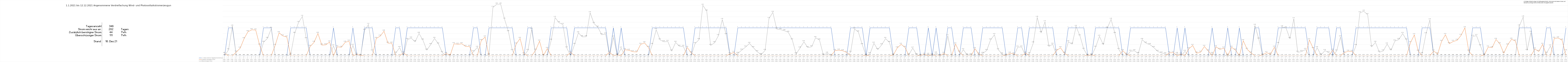
| Category | 1 = Strom reicht im Tagesdurchschnitt aus | Zusätzlich benötigter Strom | Überschüssiger Strom |
|---|---|---|---|
| 0 | 0 | 0.08 | 0 |
| 1 | 1 | 0 | 0.21 |
| 2 | 1 | 0 | 1.06 |
| 3 | 0 | 0.13 | 0 |
| 4 | 0 | 0.27 | 0 |
| 5 | 0 | 0.61 | 0 |
| 6 | 0 | 0.86 | 0 |
| 7 | 0 | 0.93 | 0 |
| 8 | 0 | 0.92 | 0 |
| 9 | 0 | 0.38 | 0 |
| 10 | 1 | 0 | 0.48 |
| 11 | 1 | 0 | 0.62 |
| 12 | 1 | 0 | 0.97 |
| 13 | 0 | 0.37 | 0 |
| 14 | 0 | 0.82 | 0 |
| 15 | 0 | 0.71 | 0 |
| 16 | 0 | 0.67 | 0 |
| 17 | 1 | 0 | 0.05 |
| 18 | 1 | 0 | 0.8 |
| 19 | 1 | 0 | 1.19 |
| 20 | 1 | 0 | 1.41 |
| 21 | 1 | 0 | 0.61 |
| 22 | 0 | 0.33 | 0 |
| 23 | 0 | 0.48 | 0 |
| 24 | 0 | 0.8 | 0 |
| 25 | 0 | 0.38 | 0 |
| 26 | 0 | 0.39 | 0 |
| 27 | 0 | 0.49 | 0 |
| 28 | 1 | 0 | 0.35 |
| 29 | 0 | 0.32 | 0 |
| 30 | 0 | 0.3 | 0 |
| 31 | 0 | 0.48 | 0 |
| 32 | 0 | 0.52 | 0 |
| 33 | 1 | 0 | 0.37 |
| 34 | 0 | 0.05 | 0 |
| 35 | 0 | 0.01 | 0 |
| 36 | 1 | 0 | 0.91 |
| 37 | 1 | 0 | 1.12 |
| 38 | 1 | 0 | 0.17 |
| 39 | 0 | 0.62 | 0 |
| 40 | 0 | 0.7 | 0 |
| 41 | 0 | 0.88 | 0 |
| 42 | 0 | 0.45 | 0 |
| 43 | 0 | 0.45 | 0 |
| 44 | 1 | 0 | 0.09 |
| 45 | 1 | 0 | 0.29 |
| 46 | 0 | 0.1 | 0 |
| 47 | 1 | 0 | 0.58 |
| 48 | 1 | 0 | 0.63 |
| 49 | 1 | 0 | 0.5 |
| 50 | 1 | 0 | 0.8 |
| 51 | 1 | 0 | 0.56 |
| 52 | 1 | 0 | 0.2 |
| 53 | 1 | 0 | 0.4 |
| 54 | 1 | 0 | 0.62 |
| 55 | 1 | 0 | 0.42 |
| 56 | 1 | 0 | 0.11 |
| 57 | 0 | 0.08 | 0 |
| 58 | 0 | 0.01 | 0 |
| 59 | 0 | 0.43 | 0 |
| 60 | 0 | 0.41 | 0 |
| 61 | 0 | 0.43 | 0 |
| 62 | 0 | 0.33 | 0 |
| 63 | 0 | 0.33 | 0 |
| 64 | 1 | 0 | 0.14 |
| 65 | 1 | 0 | 0.3 |
| 66 | 0 | 0.54 | 0 |
| 67 | 0 | 0.67 | 0 |
| 68 | 1 | 0 | 0.04 |
| 69 | 1 | 0 | 1.73 |
| 70 | 1 | 0 | 1.85 |
| 71 | 1 | 0 | 1.85 |
| 72 | 1 | 0 | 1.31 |
| 73 | 1 | 0 | 0.861 |
| 74 | 1 | 0 | 0.185 |
| 75 | 0 | 0.42 | 0 |
| 76 | 0 | 0.619 | 0 |
| 77 | 0 | 0.064 | 0 |
| 78 | 1 | 0 | 0.187 |
| 79 | 1 | 0 | 0.946 |
| 80 | 0 | 0.198 | 0 |
| 81 | 0 | 0.523 | 0 |
| 82 | 0 | 0.007 | 0 |
| 83 | 0 | 0.257 | 0 |
| 84 | 1 | 0 | 0.555 |
| 85 | 1 | 0 | 1.369 |
| 86 | 1 | 0 | 1.186 |
| 87 | 1 | 0 | 1.12 |
| 88 | 1 | 0 | 0.278 |
| 89 | 0 | 0.117 | 0 |
| 90 | 1 | 0 | 0.403 |
| 91 | 1 | 0 | 0.819 |
| 92 | 1 | 0 | 0.676 |
| 93 | 1 | 0 | 0.681 |
| 94 | 1 | 0 | 1.541 |
| 95 | 1 | 0 | 1.158 |
| 96 | 1 | 0 | 1.022 |
| 97 | 1 | 0 | 0.752 |
| 98 | 1 | 0 | 0.776 |
| 99 | 0 | 0.123 | 0 |
| 100 | 1 | 0 | 0.665 |
| 101 | 0 | 0.034 | 0 |
| 102 | 1 | 0 | 0.269 |
| 103 | 0 | 0.218 | 0 |
| 104 | 0 | 0.193 | 0 |
| 105 | 0 | 0.144 | 0 |
| 106 | 0 | 0.133 | 0 |
| 107 | 0 | 0.407 | 0 |
| 108 | 0 | 0.46 | 0 |
| 109 | 0 | 0.3 | 0 |
| 110 | 1 | 0 | 0.402 |
| 111 | 1 | 0 | 0.934 |
| 112 | 1 | 0 | 0.567 |
| 113 | 1 | 0 | 0.498 |
| 114 | 1 | 0 | 0.509 |
| 115 | 1 | 0 | 0.167 |
| 116 | 1 | 0 | 0.478 |
| 117 | 1 | 0 | 0.336 |
| 118 | 1 | 0 | 0.331 |
| 119 | 0 | 0.296 | 0 |
| 120 | 0 | 0.103 | 0 |
| 121 | 1 | 0 | 0.432 |
| 122 | 1 | 0 | 0.575 |
| 123 | 1 | 0 | 1.808 |
| 124 | 1 | 0 | 1.602 |
| 125 | 1 | 0 | 0.369 |
| 126 | 1 | 0 | 0.463 |
| 127 | 1 | 0 | 0.716 |
| 128 | 1 | 0 | 1.296 |
| 129 | 1 | 0 | 0.755 |
| 130 | 0 | 0.067 | 0 |
| 131 | 0 | 0.117 | 0 |
| 132 | 1 | 0 | 0.081 |
| 133 | 1 | 0 | 0.2 |
| 134 | 1 | 0 | 0.31 |
| 135 | 1 | 0 | 0.44 |
| 136 | 1 | 0 | 0.289 |
| 137 | 1 | 0 | 0.142 |
| 138 | 1 | 0 | 0.041 |
| 139 | 1 | 0 | 0.186 |
| 140 | 1 | 0 | 1.332 |
| 141 | 1 | 0 | 1.555 |
| 142 | 1 | 0 | 0.955 |
| 143 | 1 | 0 | 0.938 |
| 144 | 1 | 0 | 0.894 |
| 145 | 1 | 0 | 0.838 |
| 146 | 1 | 0 | 0.567 |
| 147 | 1 | 0 | 0.064 |
| 148 | 1 | 0 | 0.276 |
| 149 | 1 | 0 | 0.498 |
| 150 | 1 | 0 | 0.292 |
| 151 | 1 | 0 | 0.321 |
| 152 | 1 | 0 | 0.646 |
| 153 | 1 | 0 | 0.563 |
| 154 | 1 | 0 | 0.026 |
| 155 | 1 | 0 | 0.087 |
| 156 | 1 | 0 | 0.009 |
| 157 | 0 | 0.184 | 0 |
| 158 | 0 | 0.199 | 0 |
| 159 | 0 | 0.177 | 0 |
| 160 | 0 | 0.116 | 0 |
| 161 | 1 | 0 | 0.12 |
| 162 | 1 | 0 | 0.959 |
| 163 | 1 | 0 | 0.851 |
| 164 | 1 | 0 | 0.397 |
| 165 | 0 | 0.017 | 0 |
| 166 | 1 | 0 | 0.069 |
| 167 | 1 | 0 | 0.445 |
| 168 | 1 | 0 | 0.221 |
| 169 | 1 | 0 | 0.389 |
| 170 | 1 | 0 | 0.615 |
| 171 | 1 | 0 | 0.476 |
| 172 | 0 | 0.027 | 0 |
| 173 | 0 | 0.28 | 0 |
| 174 | 0 | 0.406 | 0 |
| 175 | 0 | 0.3 | 0 |
| 176 | 1 | 0 | 0.042 |
| 177 | 1 | 0 | 0.271 |
| 178 | 1 | 0 | 0.038 |
| 179 | 0 | 0.014 | 0 |
| 180 | 0 | 0.049 | 0 |
| 181 | 1 | 0 | 0.046 |
| 182 | 0 | 0.038 | 0 |
| 183 | 1 | 0 | 0.09 |
| 184 | 0 | 0.005 | 0 |
| 185 | 0 | 0.084 | 0 |
| 186 | 1 | 0 | 0.711 |
| 187 | 1 | 0 | 0.006 |
| 188 | 0 | 0.419 | 0 |
| 189 | 0 | 0.129 | 0 |
| 190 | 1 | 0 | 0.215 |
| 191 | 1 | 0 | 0.026 |
| 192 | 1 | 0 | 0.038 |
| 193 | 0 | 0.249 | 0 |
| 194 | 0 | 0.057 | 0 |
| 195 | 1 | 0 | 0.084 |
| 196 | 1 | 0 | 0.185 |
| 197 | 1 | 0 | 0.563 |
| 198 | 1 | 0 | 0.753 |
| 199 | 1 | 0 | 0.212 |
| 200 | 1 | 0 | 0.058 |
| 201 | 0 | 0.018 | 0 |
| 202 | 0 | 0.087 | 0 |
| 203 | 0 | 0.063 | 0 |
| 204 | 1 | 0 | 0.307 |
| 205 | 1 | 0 | 0.312 |
| 206 | 0 | 0.092 | 0 |
| 207 | 1 | 0 | 0.071 |
| 208 | 1 | 0 | 0.458 |
| 209 | 1 | 0 | 1.377 |
| 210 | 1 | 0 | 0.826 |
| 211 | 1 | 0 | 1.216 |
| 212 | 1 | 0 | 0.333 |
| 213 | 1 | 0 | 0.411 |
| 214 | 0 | 0.189 | 0 |
| 215 | 0 | 0.284 | 0 |
| 216 | 0 | 0.088 | 0 |
| 217 | 1 | 0 | 0.496 |
| 218 | 1 | 0 | 0.417 |
| 219 | 1 | 0 | 1.046 |
| 220 | 1 | 0 | 0.708 |
| 221 | 1 | 0 | 0.229 |
| 222 | 0 | 0.015 | 0 |
| 223 | 0 | 0.029 | 0 |
| 224 | 1 | 0 | 0.301 |
| 225 | 1 | 0 | 0.696 |
| 226 | 1 | 0 | 0.397 |
| 227 | 1 | 0 | 0.987 |
| 228 | 1 | 0 | 1.305 |
| 229 | 1 | 0 | 0.797 |
| 230 | 1 | 0 | 0.223 |
| 231 | 0 | 0.18 | 0 |
| 232 | 0 | 0.049 | 0 |
| 233 | 1 | 0 | 0.158 |
| 234 | 1 | 0 | 0.178 |
| 235 | 1 | 0 | 0.078 |
| 236 | 1 | 0 | 0.577 |
| 237 | 1 | 0 | 0.449 |
| 238 | 1 | 0 | 0.398 |
| 239 | 1 | 0 | 0.292 |
| 240 | 1 | 0 | 0.153 |
| 241 | 1 | 0 | 0.097 |
| 242 | 1 | 0 | 0.074 |
| 243 | 0 | 0.103 | 0 |
| 244 | 0 | 0.112 | 0 |
| 245 | 1 | 0 | 0.078 |
| 246 | 0 | 0.056 | 0 |
| 247 | 1 | 0 | 0.156 |
| 248 | 0 | 0.249 | 0 |
| 249 | 0 | 0.367 | 0 |
| 250 | 0 | 0.092 | 0 |
| 251 | 0 | 0.123 | 0 |
| 252 | 0 | 0.331 | 0 |
| 253 | 0 | 0.17 | 0 |
| 254 | 1 | 0 | 0.078 |
| 255 | 0 | 0.317 | 0 |
| 256 | 0 | 0.226 | 0 |
| 257 | 0 | 0.274 | 0 |
| 258 | 1 | 0 | 0.02 |
| 259 | 0 | 0.301 | 0 |
| 260 | 0 | 0.203 | 0 |
| 261 | 1 | 0 | 0.011 |
| 262 | 0 | 0.537 | 0 |
| 263 | 0 | 0.23 | 0 |
| 264 | 0 | 0.096 | 0 |
| 265 | 1 | 0 | 1.087 |
| 266 | 1 | 0 | 0.594 |
| 267 | 0 | 0.029 | 0 |
| 268 | 0 | 0.108 | 0 |
| 269 | 0 | 0.055 | 0 |
| 270 | 0 | 0.304 | 0 |
| 271 | 1 | 0 | 0.433 |
| 272 | 1 | 0 | 1.035 |
| 273 | 1 | 0 | 0.991 |
| 274 | 1 | 0 | 0.612 |
| 275 | 1 | 0 | 1.327 |
| 276 | 1 | 0 | 0.123 |
| 277 | 1 | 0 | 0.147 |
| 278 | 1 | 0 | 0.223 |
| 279 | 0 | 0.566 | 0 |
| 280 | 0 | 0.256 | 0 |
| 281 | 1 | 0 | 0.288 |
| 282 | 1 | 0 | 0.028 |
| 283 | 1 | 0 | 0.181 |
| 284 | 1 | 0 | 0.109 |
| 285 | 0 | 0.196 | 0 |
| 286 | 1 | 0 | 0.167 |
| 287 | 1 | 0 | 0.672 |
| 288 | 0 | 0.113 | 0 |
| 289 | 0 | 0.159 | 0 |
| 290 | 0 | 0.153 | 0 |
| 291 | 1 | 0 | 0.362 |
| 292 | 1 | 0 | 1.54 |
| 293 | 1 | 0 | 1.594 |
| 294 | 1 | 0 | 1.472 |
| 295 | 1 | 0 | 0.321 |
| 296 | 1 | 0 | 0.479 |
| 297 | 1 | 0 | 0.125 |
| 298 | 1 | 0 | 0.171 |
| 299 | 1 | 0 | 0.416 |
| 300 | 1 | 0 | 0.197 |
| 301 | 1 | 0 | 0.525 |
| 302 | 1 | 0 | 0.579 |
| 303 | 1 | 0 | 0.794 |
| 304 | 1 | 0 | 0.562 |
| 305 | 0 | 0.466 | 0 |
| 306 | 0 | 0.747 | 0 |
| 307 | 0 | 0.162 | 0 |
| 308 | 1 | 0 | 0.076 |
| 309 | 1 | 0 | 0.786 |
| 310 | 1 | 0 | 1.284 |
| 311 | 0 | 0.166 | 0 |
| 312 | 0 | 0.062 | 0 |
| 313 | 0 | 0.512 | 0 |
| 314 | 0 | 0.754 | 0 |
| 315 | 0 | 0.432 | 0 |
| 316 | 0 | 0.512 | 0 |
| 317 | 0 | 0.552 | 0 |
| 318 | 0 | 0.728 | 0 |
| 319 | 0 | 1.001 | 0 |
| 320 | 0 | 0.163 | 0 |
| 321 | 1 | 0 | 0.695 |
| 322 | 1 | 0 | 0.717 |
| 323 | 1 | 0 | 0.353 |
| 324 | 0 | 0.028 | 0 |
| 325 | 0 | 0.312 | 0 |
| 326 | 0 | 0.288 | 0 |
| 327 | 0 | 0.583 | 0 |
| 328 | 0 | 0.426 | 0 |
| 329 | 0 | 0.09 | 0 |
| 330 | 0 | 0.386 | 0 |
| 331 | 0 | 0.589 | 0 |
| 332 | 0 | 0.526 | 0 |
| 333 | 1 | 0 | 1.065 |
| 334 | 1 | 0 | 1.387 |
| 335 | 1 | 0 | 0.189 |
| 336 | 1 | 0 | 0.838 |
| 337 | 0 | 0.24 | 0 |
| 338 | 0 | 0.152 | 0 |
| 339 | 0 | 0.408 | 0 |
| 340 | 1 | 0 | 0.089 |
| 341 | 1 | 0 | 0.347 |
| 342 | 0 | 0.625 | 0 |
| 343 | 0 | 0.636 | 0 |
| 344 | 0 | 0.558 | 0 |
| 345 | 1 | 0 | 0.176 |